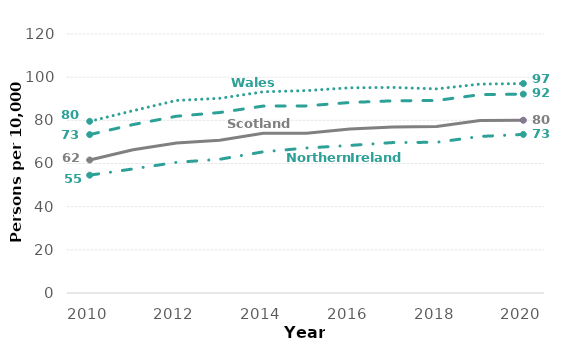
| Category | England | Wales | Northern Ireland | Scotland |
|---|---|---|---|---|
| 2010.0 | 73.376 | 79.532 | 54.592 | 61.628 |
| 2011.0 | 78.034 | 84.465 | 57.487 | 66.358 |
| 2012.0 | 81.894 | 89.208 | 60.538 | 69.454 |
| 2013.0 | 83.618 | 90.202 | 61.96 | 70.743 |
| 2014.0 | 86.604 | 93.223 | 65.406 | 73.962 |
| 2015.0 | 86.695 | 93.776 | 67.19 | 74.065 |
| 2016.0 | 88.269 | 95.084 | 68.368 | 75.984 |
| 2017.0 | 89.042 | 95.24 | 69.718 | 76.915 |
| 2018.0 | 89.193 | 94.573 | 69.822 | 77.099 |
| 2019.0 | 91.899 | 96.788 | 72.526 | 79.911 |
| 2020.0 | 92.142 | 97.047 | 73.474 | 80.038 |